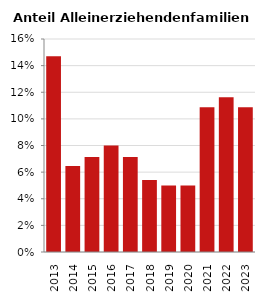
| Category | Anteil Alleinerziehende an Familien |
|---|---|
| 2013.0 | 0.147 |
| 2014.0 | 0.065 |
| 2015.0 | 0.071 |
| 2016.0 | 0.08 |
| 2017.0 | 0.071 |
| 2018.0 | 0.054 |
| 2019.0 | 0.05 |
| 2020.0 | 0.05 |
| 2021.0 | 0.109 |
| 2022.0 | 0.116 |
| 2023.0 | 0.109 |